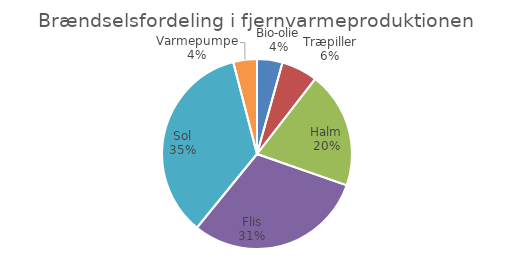
| Category | Series 0 |
|---|---|
| Bio-olie | 0.043 |
| Træpiller | 0.062 |
| Halm | 0.198 |
| Flis | 0.305 |
| Sol | 0.351 |
| Varmepumpe | 0.04 |